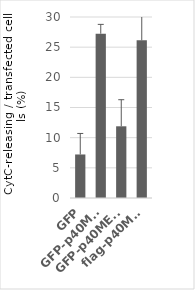
| Category | % CytC + |
|---|---|
| GFP | 7.215 |
| GFP-p40MET  | 27.234 |
| GFP-p40MET D1374N | 11.884 |
| flag-p40MET | 26.139 |